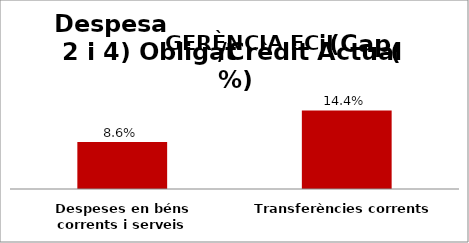
| Category | Series 0 |
|---|---|
| Despeses en béns corrents i serveis | 0.086 |
| Transferències corrents | 0.144 |